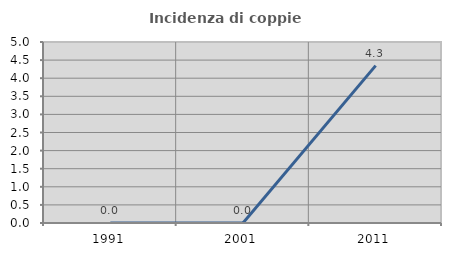
| Category | Incidenza di coppie miste |
|---|---|
| 1991.0 | 0 |
| 2001.0 | 0 |
| 2011.0 | 4.348 |